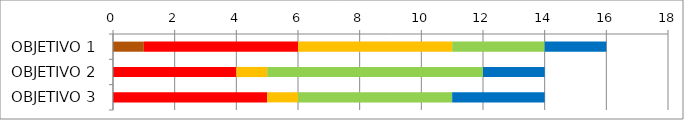
| Category | Series 0 | Series 1 | Series 2 | Series 3 | Series 4 | Series 5 |
|---|---|---|---|---|---|---|
| OBJETIVO 1 | 1 | 0 | 5 | 5 | 3 | 2 |
| OBJETIVO 2 | 0 | 0 | 4 | 1 | 7 | 2 |
| OBJETIVO 3 | 0 | 0 | 5 | 1 | 5 | 3 |